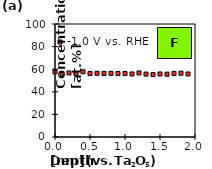
| Category | -1.0 V vs. RHE |
|---|---|
| 0.0 | 57.663 |
| 0.1 | 56.302 |
| 0.2 | 56.666 |
| 0.3 | 56.245 |
| 0.4 | 57.72 |
| 0.5 | 56.115 |
| 0.6 | 56.423 |
| 0.7 | 56.223 |
| 0.80001 | 56.332 |
| 0.9000100000000001 | 56.174 |
| 1.00006 | 56.185 |
| 1.10006 | 55.785 |
| 1.20006 | 56.706 |
| 1.30006 | 55.677 |
| 1.40006 | 55.254 |
| 1.50009 | 55.791 |
| 1.6000899999999998 | 55.583 |
| 1.7000899999999999 | 56.239 |
| 1.80009 | 56.452 |
| 1.9000899999999998 | 55.768 |